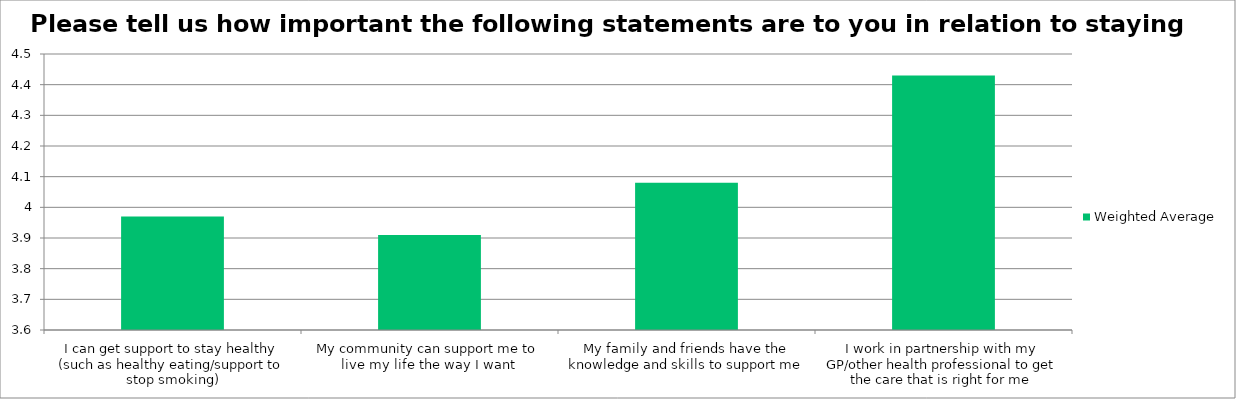
| Category | Weighted Average |
|---|---|
| I can get support to stay healthy (such as healthy eating/support to stop smoking) | 3.97 |
| My community can support me to live my life the way I want | 3.91 |
| My family and friends have the knowledge and skills to support me | 4.08 |
| I work in partnership with my GP/other health professional to get the care that is right for me | 4.43 |